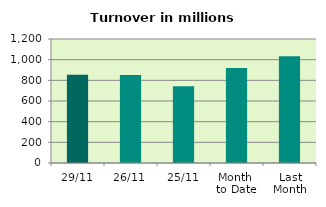
| Category | Series 0 |
|---|---|
| 29/11 | 854.531 |
| 26/11 | 851.328 |
| 25/11 | 743.357 |
| Month 
to Date | 919.558 |
| Last
Month | 1032.218 |